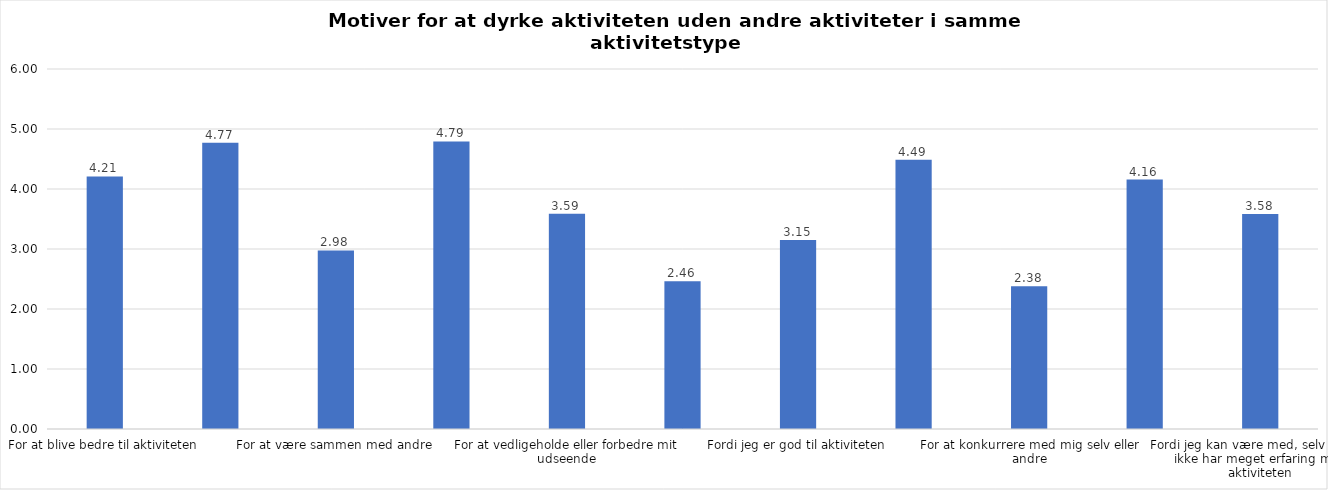
| Category | Gennemsnit |
|---|---|
| For at blive bedre til aktiviteten | 4.209 |
| For at vedligeholde eller forbedre min sundhed (fx helbred, fysisk form) | 4.771 |
| For at være sammen med andre | 2.977 |
| For at gøre noget godt for mig selv | 4.792 |
| For at vedligeholde eller forbedre mit udseende | 3.587 |
| Fordi andre i min omgangskreds opmuntrer mig til det | 2.463 |
| Fordi jeg er god til aktiviteten | 3.152 |
| Fordi jeg godt kan lide aktiviteten | 4.487 |
| For at konkurrere med mig selv eller andre | 2.379 |
| Fordi aktiviteten passer godt ind i min hverdag | 4.157 |
| Fordi jeg kan være med, selv om jeg ikke har meget erfaring med aktiviteten | 3.584 |